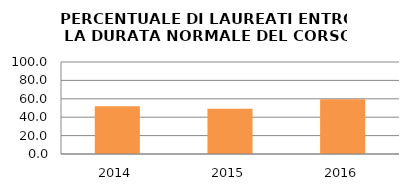
| Category | 2014 2015 2016 |
|---|---|
| 2014.0 | 51.938 |
| 2015.0 | 49.219 |
| 2016.0 | 59.542 |